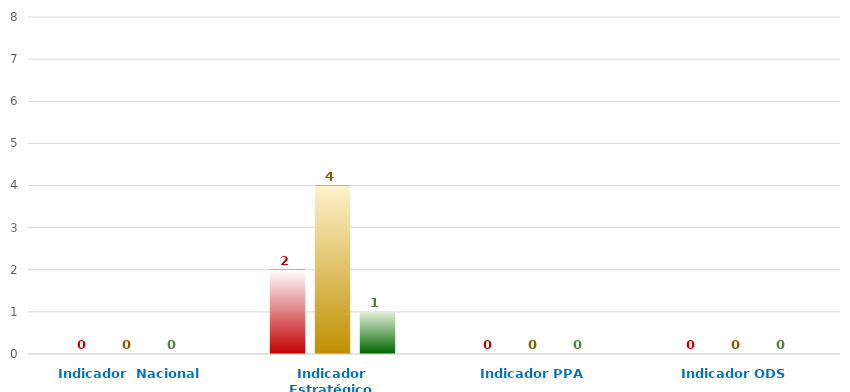
| Category | Series 0 | Series 1 | Series 2 |
|---|---|---|---|
| Indicador  Nacional | 0 | 0 | 0 |
| Indicador Estratégico | 2 | 4 | 1 |
| Indicador PPA | 0 | 0 | 0 |
| Indicador ODS | 0 | 0 | 0 |